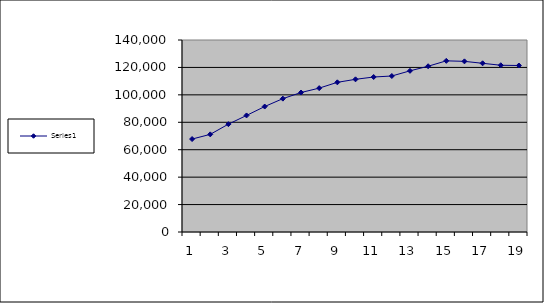
| Category | Series 0 |
|---|---|
| 0 | 67770 |
| 1 | 71190 |
| 2 | 78640 |
| 3 | 84990 |
| 4 | 91480 |
| 5 | 97250 |
| 6 | 101700 |
| 7 | 104900 |
| 8 | 109130 |
| 9 | 111330 |
| 10 | 113010 |
| 11 | 113750 |
| 12 | 117510 |
| 13 | 120870 |
| 14 | 124805 |
| 15 | 124430 |
| 16 | 123010 |
| 17 | 121580 |
| 18 | 121397 |